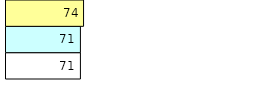
| Category | Total Standouts | Total Recd | Total Tipsters |
|---|---|---|---|
| 0 | 71 | 71 | 74 |